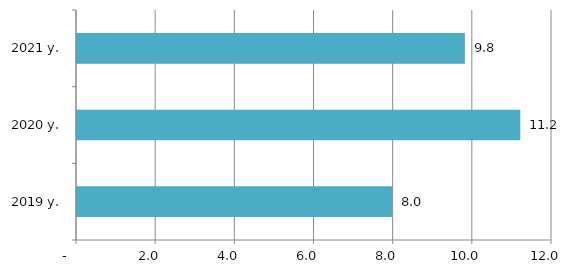
| Category | Series 0 |
|---|---|
| 2019 y. | 7.961 |
| 2020 y. | 11.2 |
| 2021 y. | 9.8 |